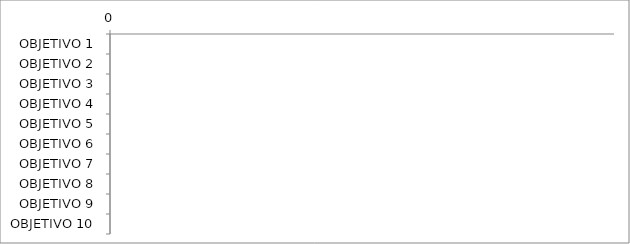
| Category | Series 0 | Series 3 | Series 1 |
|---|---|---|---|
| OBJETIVO 1 | 0 | 0 | 0 |
| OBJETIVO 2 | 0 | 0 | 0 |
| OBJETIVO 3 | 0 | 0 | 0 |
| OBJETIVO 4 | 0 | 0 | 0 |
| OBJETIVO 5 | 0 | 0 | 0 |
| OBJETIVO 6 | 0 | 0 | 0 |
| OBJETIVO 7 | 0 | 0 | 0 |
| OBJETIVO 8 | 0 | 0 | 0 |
| OBJETIVO 9 | 0 | 0 | 0 |
| OBJETIVO 10 | 0 | 0 | 0 |